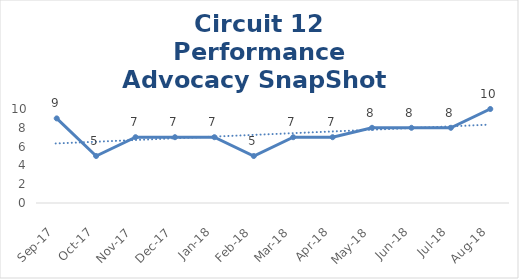
| Category | Circuit 12 |
|---|---|
| Sep-17 | 9 |
| Oct-17 | 5 |
| Nov-17 | 7 |
| Dec-17 | 7 |
| Jan-18 | 7 |
| Feb-18 | 5 |
| Mar-18 | 7 |
| Apr-18 | 7 |
| May-18 | 8 |
| Jun-18 | 8 |
| Jul-18 | 8 |
| Aug-18 | 10 |